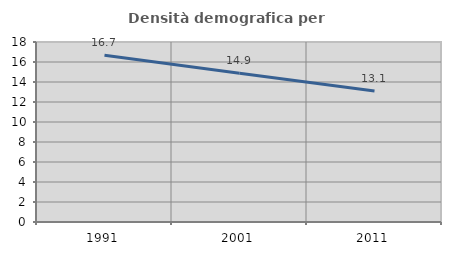
| Category | Densità demografica |
|---|---|
| 1991.0 | 16.665 |
| 2001.0 | 14.879 |
| 2011.0 | 13.094 |